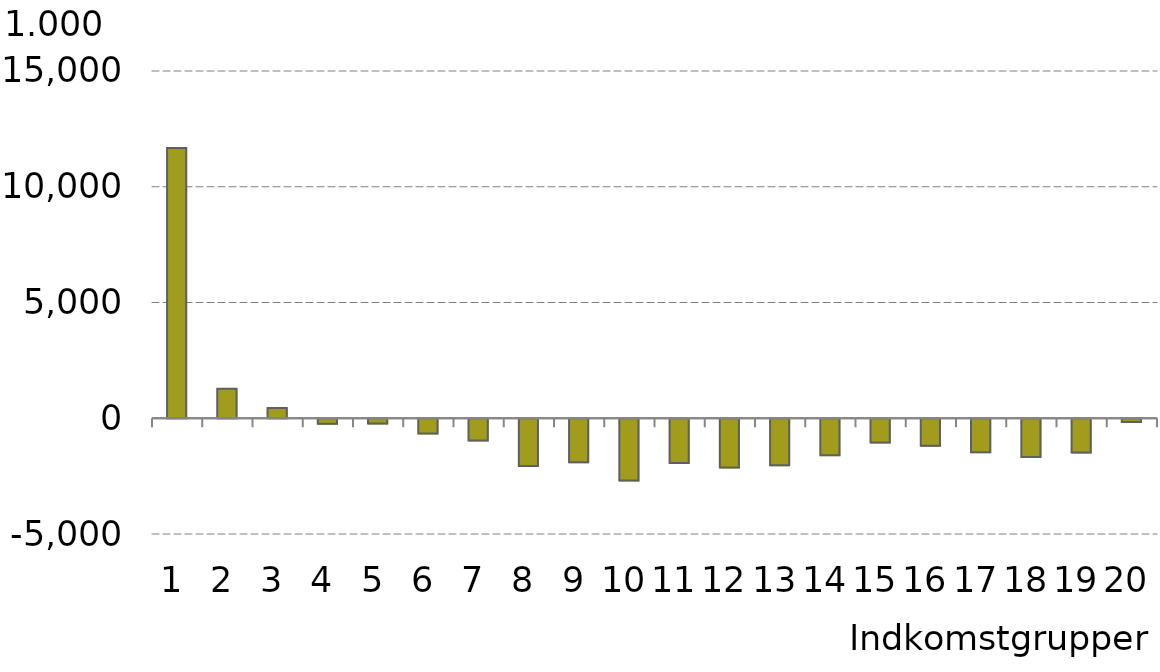
| Category |  Indkomstgrupper |
|---|---|
| 0 | 11672.641 |
| 1 | 1272.031 |
| 2 | 438.273 |
| 3 | -238.227 |
| 4 | -229.625 |
| 5 | -654.484 |
| 6 | -961.625 |
| 7 | -2059.266 |
| 8 | -1901.125 |
| 9 | -2691.93 |
| 10 | -1931.172 |
| 11 | -2131.172 |
| 12 | -2034.188 |
| 13 | -1593.453 |
| 14 | -1046.75 |
| 15 | -1191.594 |
| 16 | -1465.875 |
| 17 | -1669.875 |
| 18 | -1482.406 |
| 19 | -160.281 |